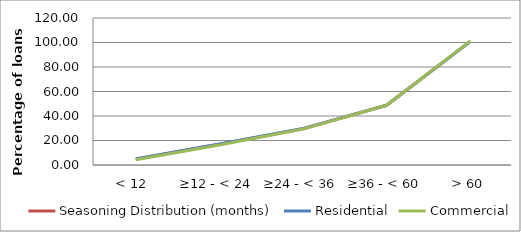
| Category | Seasoning Distribution (months) | Residential | Commercial |
|---|---|---|---|
| < 12  | 4.915 | 5.015 | 4.339 |
| ≥12 - < 24 | 16.995 | 17.182 | 16.377 |
| ≥24 - < 36 | 29.639 | 29.729 | 29.323 |
| ≥36 - < 60 | 48.731 | 48.729 | 48.743 |
| > 60 | 100.88 | 100.828 | 101.099 |